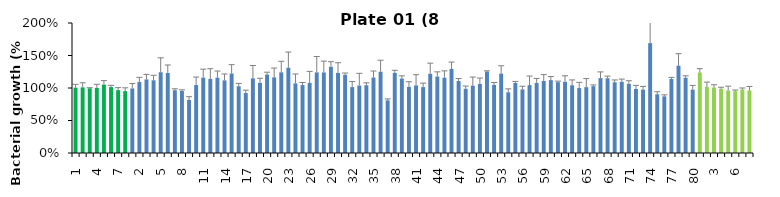
| Category | 8 h % |
|---|---|
| 1.0 | 1.006 |
| 2.0 | 1.01 |
| 3.0 | 0.996 |
| 4.0 | 1.002 |
| 5.0 | 1.053 |
| 6.0 | 1.014 |
| 7.0 | 0.967 |
| 8.0 | 0.952 |
| 1.0 | 0.993 |
| 2.0 | 1.092 |
| 3.0 | 1.132 |
| 4.0 | 1.119 |
| 5.0 | 1.242 |
| 6.0 | 1.231 |
| 7.0 | 0.966 |
| 8.0 | 0.954 |
| 9.0 | 0.816 |
| 10.0 | 1.045 |
| 11.0 | 1.159 |
| 12.0 | 1.14 |
| 13.0 | 1.159 |
| 14.0 | 1.117 |
| 15.0 | 1.223 |
| 16.0 | 1.027 |
| 17.0 | 0.922 |
| 18.0 | 1.149 |
| 19.0 | 1.08 |
| 20.0 | 1.207 |
| 21.0 | 1.164 |
| 22.0 | 1.241 |
| 23.0 | 1.312 |
| 24.0 | 1.071 |
| 25.0 | 1.045 |
| 26.0 | 1.079 |
| 27.0 | 1.24 |
| 28.0 | 1.239 |
| 29.0 | 1.328 |
| 30.0 | 1.233 |
| 31.0 | 1.203 |
| 32.0 | 1.014 |
| 33.0 | 1.037 |
| 34.0 | 1.042 |
| 35.0 | 1.162 |
| 36.0 | 1.251 |
| 37.0 | 0.81 |
| 38.0 | 1.233 |
| 39.0 | 1.145 |
| 40.0 | 1.017 |
| 41.0 | 1.04 |
| 42.0 | 1.014 |
| 43.0 | 1.218 |
| 44.0 | 1.176 |
| 45.0 | 1.159 |
| 46.0 | 1.293 |
| 47.0 | 1.107 |
| 48.0 | 0.988 |
| 49.0 | 1.036 |
| 50.0 | 1.062 |
| 51.0 | 1.253 |
| 52.0 | 1.048 |
| 53.0 | 1.221 |
| 54.0 | 0.934 |
| 55.0 | 1.077 |
| 56.0 | 0.978 |
| 57.0 | 1.045 |
| 58.0 | 1.078 |
| 59.0 | 1.108 |
| 60.0 | 1.121 |
| 61.0 | 1.09 |
| 62.0 | 1.095 |
| 63.0 | 1.042 |
| 64.0 | 0.999 |
| 65.0 | 1.013 |
| 66.0 | 1.028 |
| 67.0 | 1.152 |
| 68.0 | 1.15 |
| 69.0 | 1.088 |
| 70.0 | 1.095 |
| 71.0 | 1.065 |
| 72.0 | 0.985 |
| 73.0 | 0.975 |
| 74.0 | 1.69 |
| 75.0 | 0.904 |
| 76.0 | 0.872 |
| 77.0 | 1.138 |
| 78.0 | 1.343 |
| 79.0 | 1.158 |
| 80.0 | 0.975 |
| 1.0 | 1.237 |
| 2.0 | 1.019 |
| 3.0 | 1.007 |
| 4.0 | 0.988 |
| 5.0 | 0.961 |
| 6.0 | 0.951 |
| 7.0 | 0.978 |
| 8.0 | 0.962 |